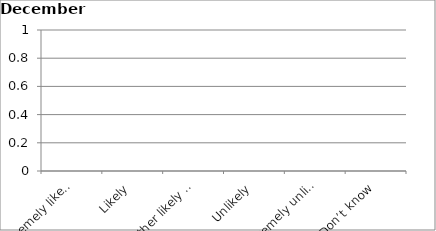
| Category | Series 0 |
|---|---|
| Extremely likely | 0 |
| Likely | 0 |
| Neither likely nor unlikely | 0 |
| Unlikely | 0 |
| Extremely unlikely | 0 |
| Don’t know | 0 |